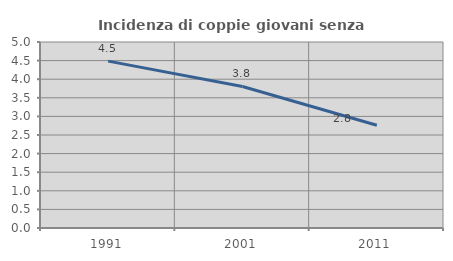
| Category | Incidenza di coppie giovani senza figli |
|---|---|
| 1991.0 | 4.485 |
| 2001.0 | 3.804 |
| 2011.0 | 2.761 |